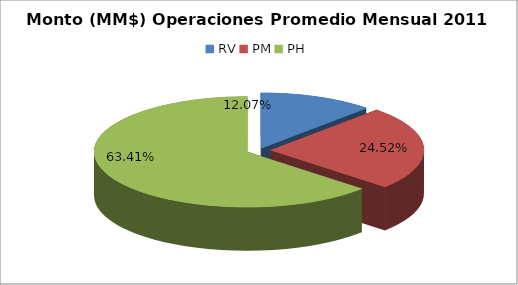
| Category | Series 0 |
|---|---|
| RV | 1421810.1 |
| PM | 2887221.836 |
| PH | 7467112.557 |